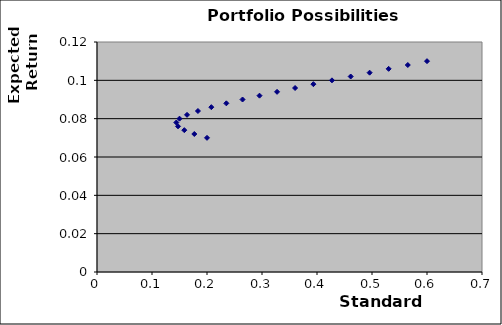
| Category | Series 0 |
|---|---|
| 0.2 | 0.07 |
| 0.17691806012954134 | 0.072 |
| 0.15874507866387544 | 0.074 |
| 0.14730919862656236 | 0.076 |
| 0.1442220510185596 | 0.078 |
| 0.15000000000000008 | 0.08 |
| 0.1637070554374491 | 0.082 |
| 0.18357559750685837 | 0.084 |
| 0.20784609690826544 | 0.086 |
| 0.23515952032609716 | 0.088 |
| 0.26457513110645936 | 0.09 |
| 0.2954657340538834 | 0.092 |
| 0.3274141108748982 | 0.094 |
| 0.3601388621073824 | 0.096 |
| 0.3934463114581203 | 0.098 |
| 0.4272001872658768 | 0.1 |
| 0.461302503786832 | 0.102 |
| 0.49568134925574936 | 0.104 |
| 0.5302829433425142 | 0.106 |
| 0.5650663677834669 | 0.108 |
| 0.6 | 0.11 |